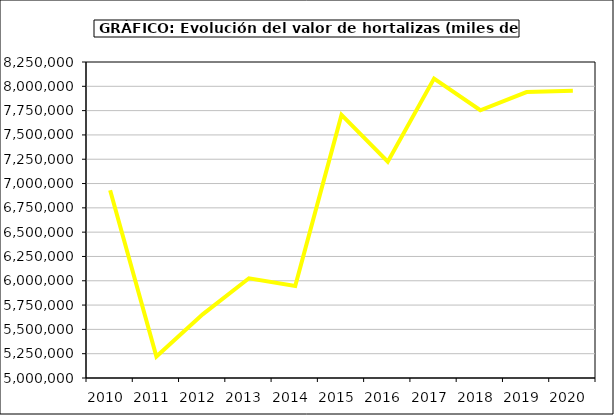
| Category | Valor |
|---|---|
| 2010.0 | 6931312.064 |
| 2011.0 | 5220724.649 |
| 2012.0 | 5654821.085 |
| 2013.0 | 6025736 |
| 2014.0 | 5945397.615 |
| 2015.0 | 7705933 |
| 2016.0 | 7225476.342 |
| 2017.0 | 8079271.573 |
| 2018.0 | 7753853.605 |
| 2019.0 | 7940649.854 |
| 2020.0 | 7953472.368 |